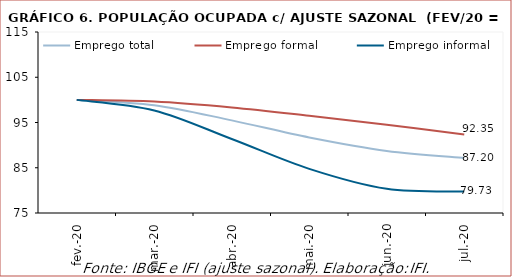
| Category | Emprego total | Emprego formal | Emprego informal |
|---|---|---|---|
| 2020-02-01 | 100 | 100 | 100 |
| 2020-03-01 | 98.827 | 99.63 | 97.665 |
| 2020-04-01 | 95.466 | 98.307 | 91.351 |
| 2020-05-01 | 91.689 | 96.476 | 84.756 |
| 2020-06-01 | 88.718 | 94.498 | 80.347 |
| 2020-07-01 | 87.195 | 92.35 | 79.731 |